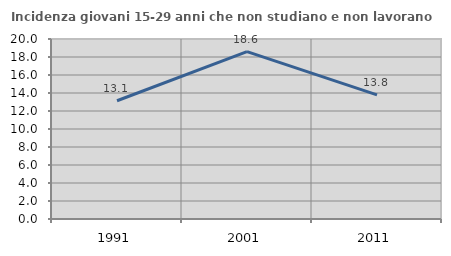
| Category | Incidenza giovani 15-29 anni che non studiano e non lavorano  |
|---|---|
| 1991.0 | 13.136 |
| 2001.0 | 18.593 |
| 2011.0 | 13.793 |